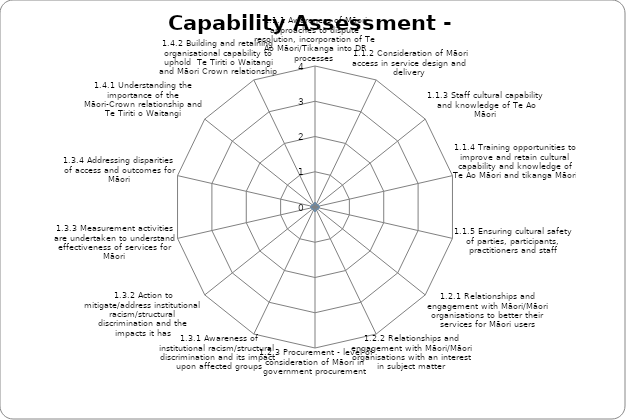
| Category | Maturity Score |
|---|---|
| 1.1.1 Awareness of Māori approaches to dispute resolution, incorporation of Te Ao Māori/Tikanga into DR processes | 0 |
| 1.1.2 Consideration of Māori access in service design and delivery | 0 |
| 1.1.3 Staff cultural capability and knowledge of Te Ao Māori | 0 |
| 1.1.4 Training opportunities to improve and retain cultural capability and knowledge of Te Ao Māori and tikanga Māori | 0 |
| 1.1.5 Ensuring cultural safety of parties, participants, practitioners and staff | 0 |
| 1.2.1 Relationships and engagement with Māori/Māori organisations to better their services for Māori users | 0 |
| 1.2.2 Relationships and engagement with Māori/Māori organisations with an interest in subject matter | 0 |
| 1.2.3 Procurement - level of consideration of Māori in government procurement | 0 |
| 1.3.1 Awareness of institutional racism/structural discrimination and its impact upon affected groups | 0 |
| 1.3.2 Action to mitigate/address institutional racism/structural discrimination and the impacts it has | 0 |
| 1.3.3 Measurement activities are undertaken to understand effectiveness of services for Māori | 0 |
| 1.3.4 Addressing disparities of access and outcomes for Māori | 0 |
| 1.4.1 Understanding the importance of the Māori-Crown relationship and Te Tiriti o Waitangi | 0 |
| 1.4.2 Building and retaining organisational capability to uphold  Te Tiriti o Waitangi and Māori Crown relationship | 0 |